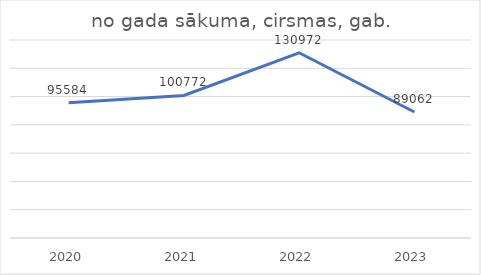
| Category | no gada sākuma, cirsmas, gab. |
|---|---|
| 2020.0 | 95584 |
| 2021.0 | 100772 |
| 2022.0 | 130972 |
| 2023.0 | 89062 |